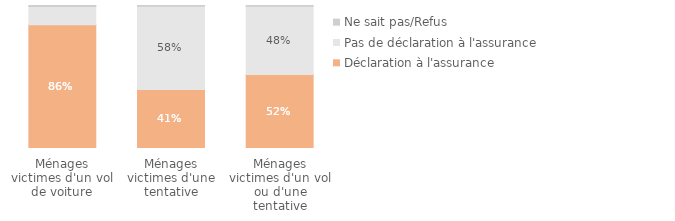
| Category | Déclaration à l'assurance | Pas de déclaration à l'assurance | Ne sait pas/Refus |
|---|---|---|---|
| Ménages victimes d'un vol ou d'une tentative | 0.517 | 0.477 | 0.006 |
| Ménages victimes d'une tentative | 0.413 | 0.582 | 0.005 |
| Ménages victimes d'un vol de voiture | 0.865 | 0.128 | 0.007 |